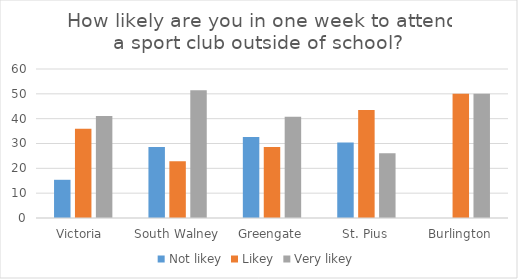
| Category | Not likey | Likey | Very likey |
|---|---|---|---|
| Victoria  | 15.385 | 35.897 | 41.026 |
| South Walney | 28.571 | 22.857 | 51.429 |
| Greengate | 32.653 | 28.571 | 40.816 |
| St. Pius | 30.435 | 43.478 | 26.087 |
| Burlington | 0 | 50 | 50 |